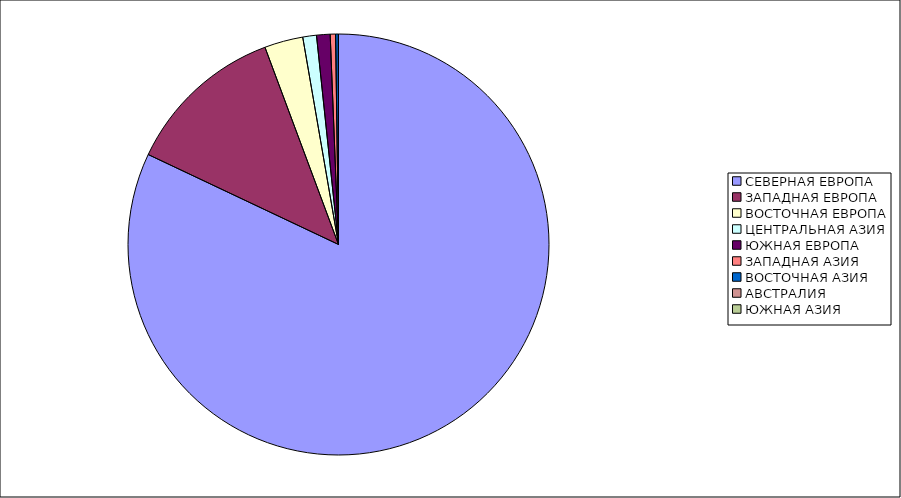
| Category | Оборот |
|---|---|
| СЕВЕРНАЯ ЕВРОПА | 82.02 |
| ЗАПАДНАЯ ЕВРОПА | 12.29 |
| ВОСТОЧНАЯ ЕВРОПА | 2.96 |
| ЦЕНТРАЛЬНАЯ АЗИЯ | 1.05 |
| ЮЖНАЯ ЕВРОПА | 1.04 |
| ЗАПАДНАЯ АЗИЯ | 0.41 |
| ВОСТОЧНАЯ АЗИЯ | 0.21 |
| АВСТРАЛИЯ | 0.01 |
| ЮЖНАЯ АЗИЯ | 0 |